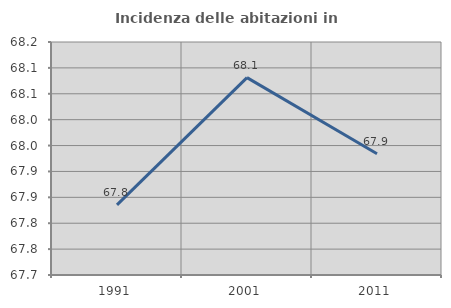
| Category | Incidenza delle abitazioni in proprietà  |
|---|---|
| 1991.0 | 67.835 |
| 2001.0 | 68.081 |
| 2011.0 | 67.934 |